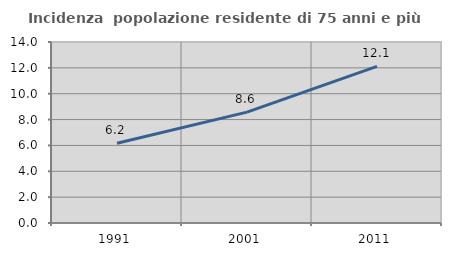
| Category | Incidenza  popolazione residente di 75 anni e più |
|---|---|
| 1991.0 | 6.17 |
| 2001.0 | 8.574 |
| 2011.0 | 12.109 |